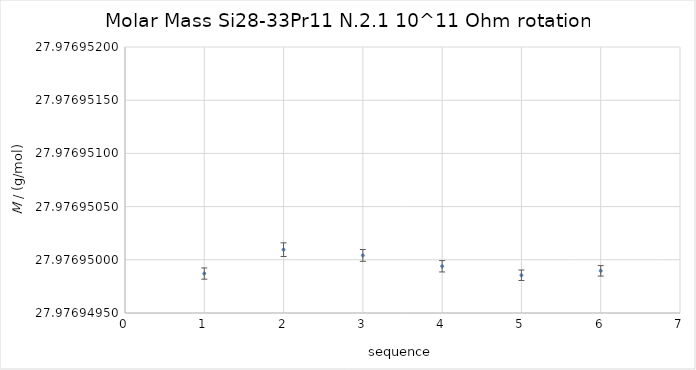
| Category | Series 0 |
|---|---|
| 0 | 27.977 |
| 1 | 27.977 |
| 2 | 27.977 |
| 3 | 27.977 |
| 4 | 27.977 |
| 5 | 27.977 |